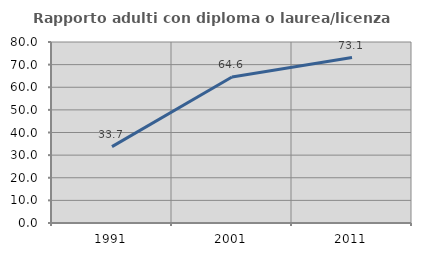
| Category | Rapporto adulti con diploma o laurea/licenza media  |
|---|---|
| 1991.0 | 33.742 |
| 2001.0 | 64.557 |
| 2011.0 | 73.118 |